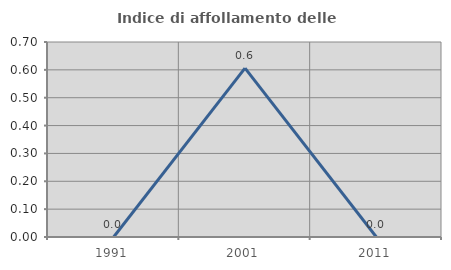
| Category | Indice di affollamento delle abitazioni  |
|---|---|
| 1991.0 | 0 |
| 2001.0 | 0.606 |
| 2011.0 | 0 |